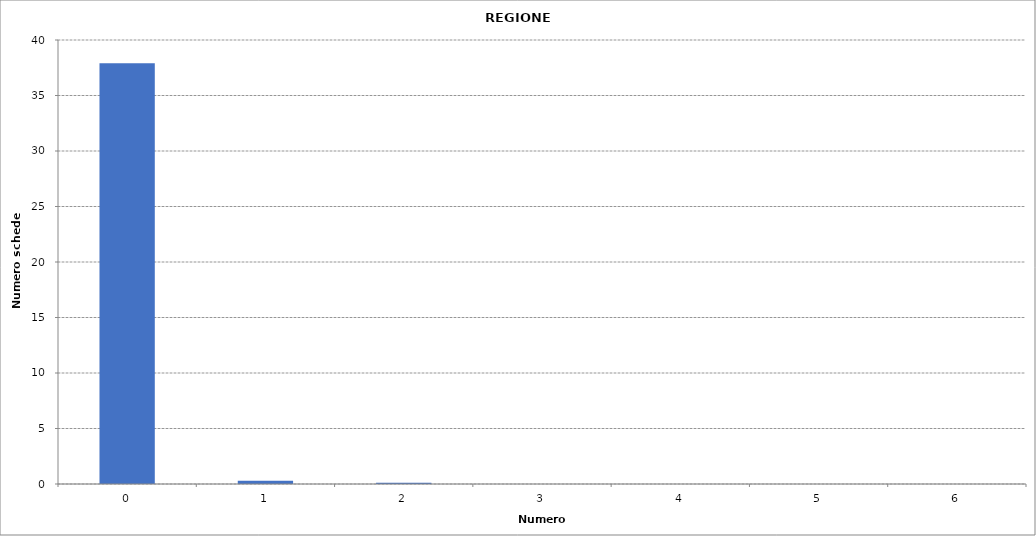
| Category | Series 0 |
|---|---|
| 0.0 | 37906 |
| 1.0 | 297 |
| 2.0 | 107 |
| 3.0 | 1 |
| 4.0 | 1 |
| 5.0 | 3 |
| 6.0 | 1 |